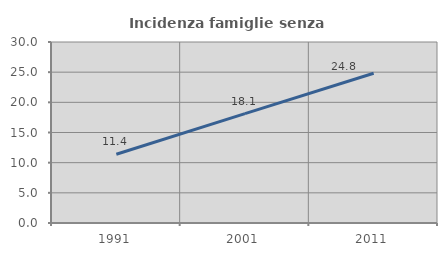
| Category | Incidenza famiglie senza nuclei |
|---|---|
| 1991.0 | 11.399 |
| 2001.0 | 18.132 |
| 2011.0 | 24.816 |